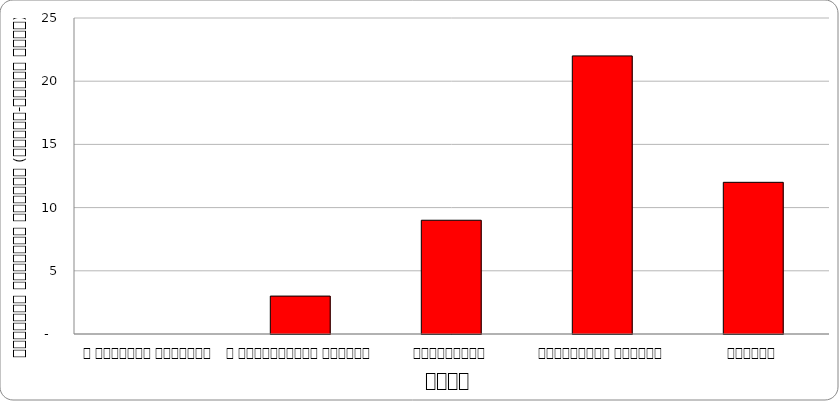
| Category | समाज |
|---|---|
| द हिमालयन टाइम्स् | 0 |
| द काठमाण्डौं पोस्ट् | 3 |
| कान्तिपुर | 9 |
| अन्नपूर्ण पोस्ट् | 22 |
| नागरिक | 12 |